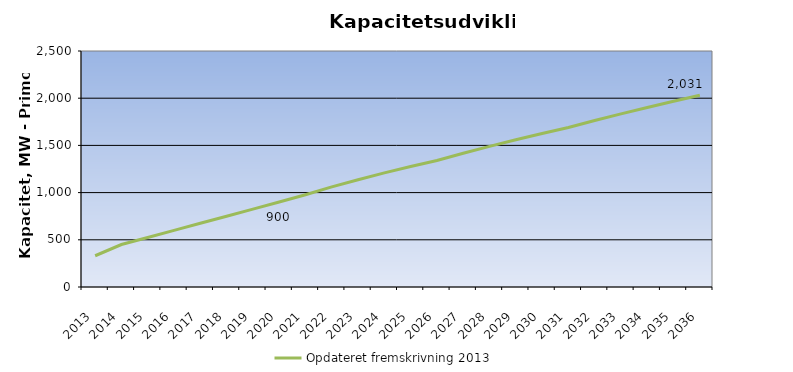
| Category | Opdateret fremskrivning 2013 |
|---|---|
| 2013.0 | 331 |
| 2014.0 | 450 |
| 2015.0 | 525 |
| 2016.0 | 600 |
| 2017.0 | 675 |
| 2018.0 | 750 |
| 2019.0 | 825 |
| 2020.0 | 900 |
| 2021.0 | 977.893 |
| 2022.0 | 1060.346 |
| 2023.0 | 1136.85 |
| 2024.0 | 1208.531 |
| 2025.0 | 1276.198 |
| 2026.0 | 1340.457 |
| 2027.0 | 1417.107 |
| 2028.0 | 1489.824 |
| 2029.0 | 1559.157 |
| 2030.0 | 1625.538 |
| 2031.0 | 1689.315 |
| 2032.0 | 1763.062 |
| 2033.0 | 1833.849 |
| 2034.0 | 1902.005 |
| 2035.0 | 1967.803 |
| 2036.0 | 2031.473 |